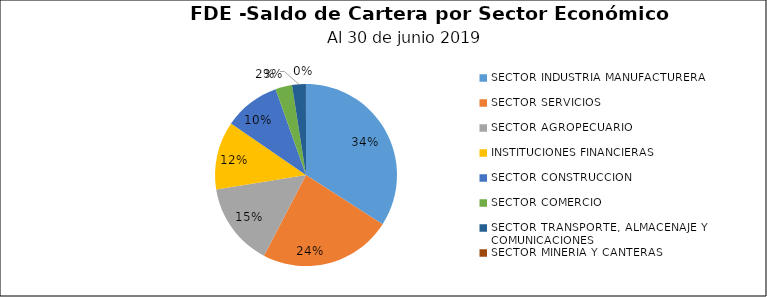
| Category | Saldo | Créditos |
|---|---|---|
| SECTOR INDUSTRIA MANUFACTURERA | 16.787 | 244 |
| SECTOR SERVICIOS | 11.609 | 179 |
| SECTOR AGROPECUARIO | 7.29 | 85 |
| INSTITUCIONES FINANCIERAS | 5.984 | 10 |
| SECTOR CONSTRUCCION | 4.923 | 15 |
| SECTOR COMERCIO | 1.453 | 174 |
| SECTOR TRANSPORTE, ALMACENAJE Y COMUNICACIONES | 1.21 | 7 |
| SECTOR MINERIA Y CANTERAS | 0.003 | 1 |